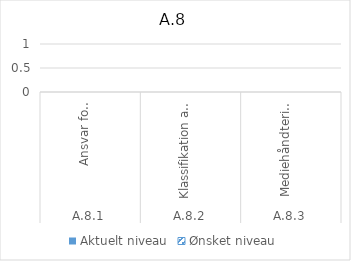
| Category | Aktuelt niveau | Ønsket niveau |
|---|---|---|
| 0 | 0 | 0 |
| 1 | 0 | 0 |
| 2 | 0 | 0 |